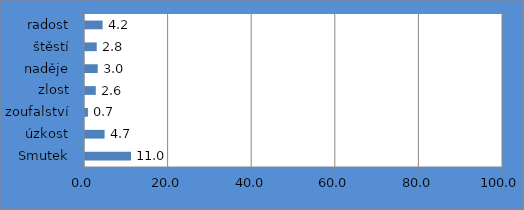
| Category | Series 0 |
|---|---|
| Smutek | 11.007 |
| úzkost | 4.684 |
| zoufalství | 0.703 |
| zlost | 2.576 |
| naděje | 3.044 |
| štěstí | 2.81 |
| radost | 4.215 |